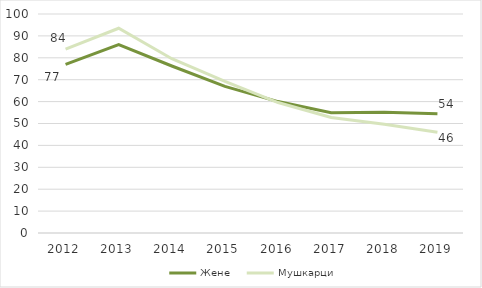
| Category | Жене  | Мушкарци |
|---|---|---|
| 2012.0 | 76.988 | 83.915 |
| 2013.0 | 86.068 | 93.489 |
| 2014.0 | 76.261 | 79.579 |
| 2015.0 | 66.948 | 69.226 |
| 2016.0 | 60.009 | 59.561 |
| 2017.0 | 54.949 | 52.754 |
| 2018.0 | 55.124 | 49.615 |
| 2019.0 | 54.458 | 45.997 |